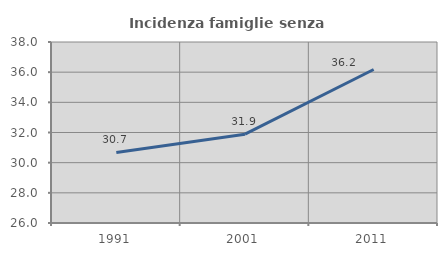
| Category | Incidenza famiglie senza nuclei |
|---|---|
| 1991.0 | 30.677 |
| 2001.0 | 31.887 |
| 2011.0 | 36.178 |